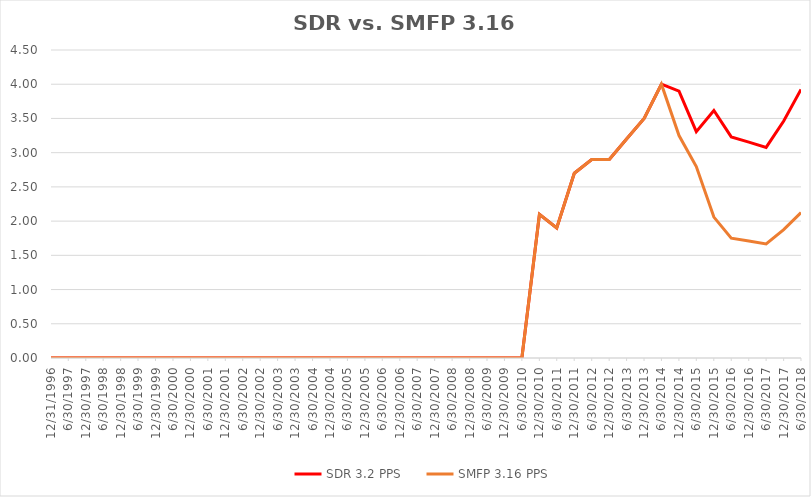
| Category | SDR 3.2 PPS | SMFP 3.16 PPS |
|---|---|---|
| 12/31/96 | 0 | 0 |
| 6/30/97 | 0 | 0 |
| 12/31/97 | 0 | 0 |
| 6/30/98 | 0 | 0 |
| 12/31/98 | 0 | 0 |
| 6/30/99 | 0 | 0 |
| 12/31/99 | 0 | 0 |
| 6/30/00 | 0 | 0 |
| 12/31/00 | 0 | 0 |
| 6/30/01 | 0 | 0 |
| 12/31/01 | 0 | 0 |
| 6/30/02 | 0 | 0 |
| 12/31/02 | 0 | 0 |
| 6/30/03 | 0 | 0 |
| 12/31/03 | 0 | 0 |
| 6/30/04 | 0 | 0 |
| 12/31/04 | 0 | 0 |
| 6/30/05 | 0 | 0 |
| 12/31/05 | 0 | 0 |
| 6/30/06 | 0 | 0 |
| 12/31/06 | 0 | 0 |
| 6/30/07 | 0 | 0 |
| 12/31/07 | 0 | 0 |
| 6/30/08 | 0 | 0 |
| 12/31/08 | 0 | 0 |
| 6/30/09 | 0 | 0 |
| 12/31/09 | 0 | 0 |
| 6/30/10 | 0 | 0 |
| 12/31/10 | 2.1 | 2.1 |
| 6/30/11 | 1.9 | 1.9 |
| 12/31/11 | 2.7 | 2.7 |
| 6/30/12 | 2.9 | 2.9 |
| 12/31/12 | 2.9 | 2.9 |
| 6/30/13 | 3.2 | 3.2 |
| 12/31/13 | 3.5 | 3.5 |
| 6/30/14 | 4 | 4 |
| 12/31/14 | 3.9 | 3.249 |
| 6/30/15 | 3.308 | 2.798 |
| 12/31/15 | 3.615 | 2.059 |
| 6/30/16 | 3.231 | 1.75 |
| 12/31/16 | 3.154 | 1.708 |
| 6/30/17 | 3.077 | 1.667 |
| 12/31/17 | 3.462 | 1.875 |
| 6/30/18 | 3.923 | 2.125 |